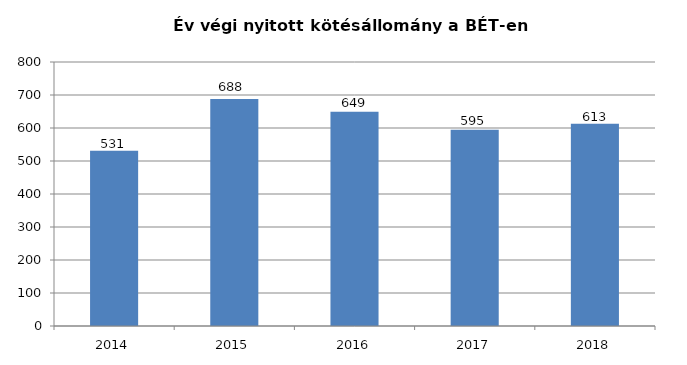
| Category | BÉT kontraktus (ezer db) |
|---|---|
| 2014.0 | 531 |
| 2015.0 | 688.194 |
| 2016.0 | 648.876 |
| 2017.0 | 595 |
| 2018.0 | 613 |